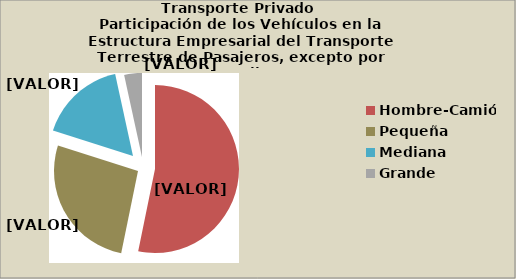
| Category | Series 0 |
|---|---|
| Hombre-Camión | 53.21 |
| Pequeña | 26.699 |
| Mediana | 16.68 |
| Grande | 3.411 |